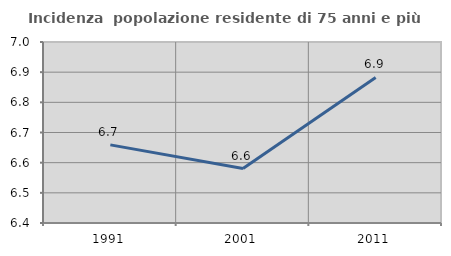
| Category | Incidenza  popolazione residente di 75 anni e più |
|---|---|
| 1991.0 | 6.659 |
| 2001.0 | 6.58 |
| 2011.0 | 6.883 |